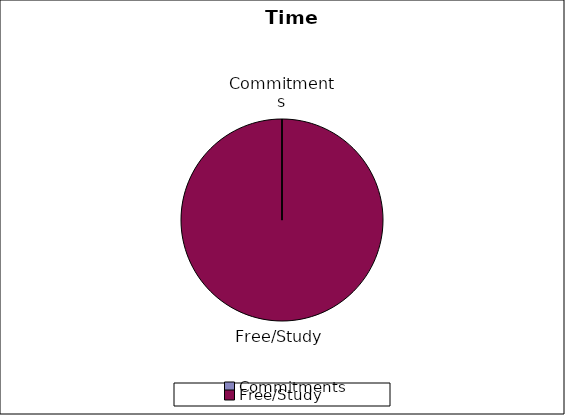
| Category | Series 0 |
|---|---|
| Commitments | 0 |
| Free/Study | 168 |